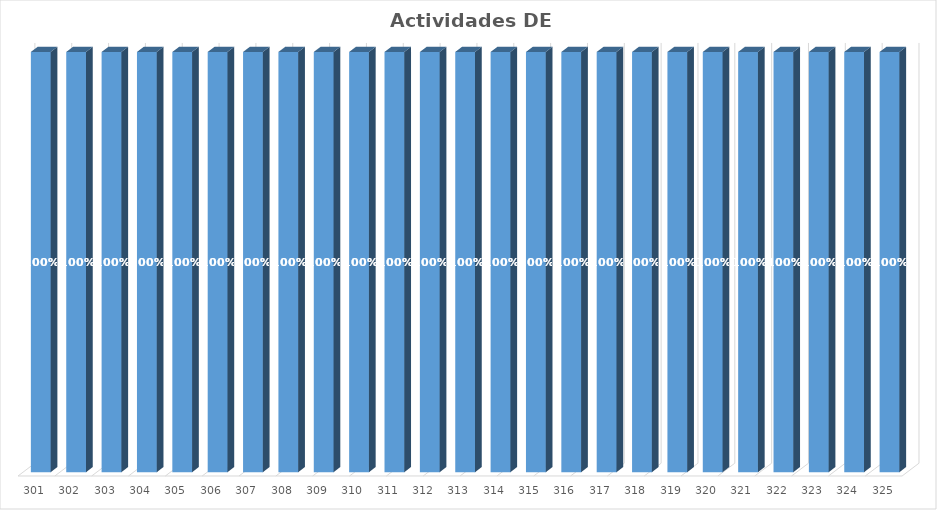
| Category | % Avance |
|---|---|
| 301.0 | 1 |
| 302.0 | 1 |
| 303.0 | 1 |
| 304.0 | 1 |
| 305.0 | 1 |
| 306.0 | 1 |
| 307.0 | 1 |
| 308.0 | 1 |
| 309.0 | 1 |
| 310.0 | 1 |
| 311.0 | 1 |
| 312.0 | 1 |
| 313.0 | 1 |
| 314.0 | 1 |
| 315.0 | 1 |
| 316.0 | 1 |
| 317.0 | 1 |
| 318.0 | 1 |
| 319.0 | 1 |
| 320.0 | 1 |
| 321.0 | 1 |
| 322.0 | 1 |
| 323.0 | 1 |
| 324.0 | 1 |
| 325.0 | 1 |